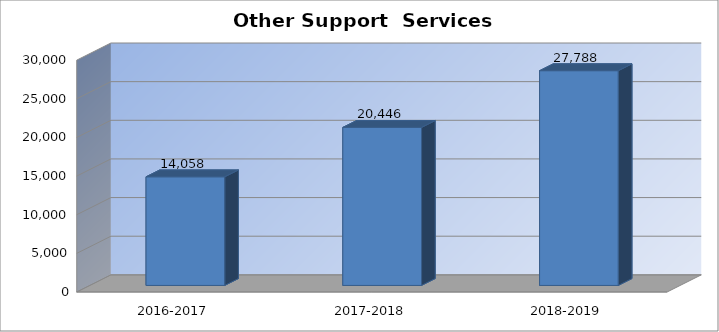
| Category | Other Support Services |
|---|---|
| 2016-2017 | 14058 |
| 2017-2018 | 20446 |
| 2018-2019 | 27788 |